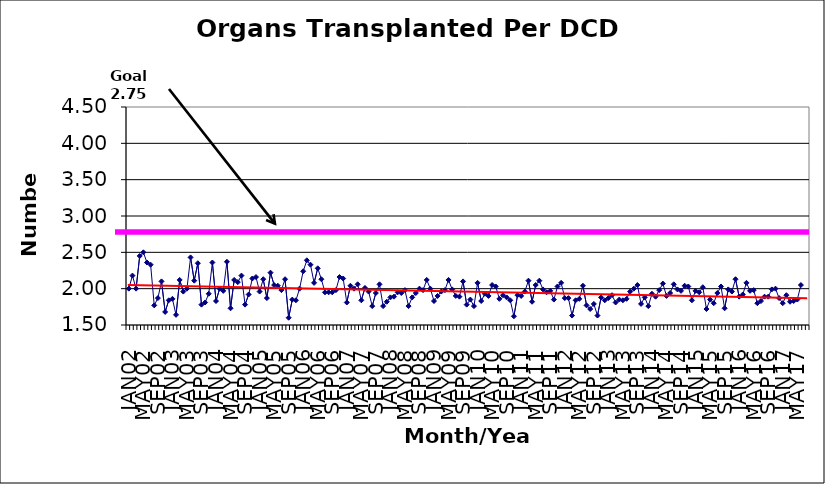
| Category | Series 0 |
|---|---|
| JAN02 | 2 |
| FEB02 | 2.18 |
| MAR02 | 2 |
| APR02 | 2.45 |
| MAY02 | 2.5 |
| JUN02 | 2.36 |
| JUL02 | 2.33 |
| AUG02 | 1.77 |
| SEP02 | 1.87 |
| OCT02 | 2.1 |
| NOV02 | 1.68 |
| DEC02 | 1.84 |
| JAN03 | 1.86 |
| FEB03 | 1.64 |
| MAR03 | 2.12 |
| APR03 | 1.96 |
| MAY03 | 2 |
| JUN03 | 2.43 |
| JUL03 | 2.11 |
| AUG03 | 2.35 |
| SEP03 | 1.78 |
| OCT03 | 1.81 |
| NOV03 | 1.93 |
| DEC03 | 2.36 |
| JAN04 | 1.83 |
| FEB04 | 2 |
| MAR04 | 1.97 |
| APR04 | 2.37 |
| MAY04 | 1.73 |
| JUN04 | 2.12 |
| JUL04 | 2.09 |
| AUG04 | 2.18 |
| SEP04 | 1.78 |
| OCT04 | 1.92 |
| NOV04 | 2.14 |
| DEC04 | 2.16 |
| JAN05 | 1.96 |
| FEB05 | 2.13 |
| MAR05 | 1.87 |
| APR05 | 2.22 |
| MAY05 | 2.05 |
| JUN05 | 2.04 |
| JUL05 | 1.98 |
| AUG05 | 2.13 |
| SEP05 | 1.6 |
| OCT05 | 1.85 |
| NOV05 | 1.84 |
| DEC05 | 2 |
| JAN06 | 2.24 |
| FEB06 | 2.39 |
| MAR06 | 2.33 |
| APR06 | 2.08 |
| MAY06 | 2.28 |
| JUN06 | 2.13 |
| JUL06 | 1.95 |
| AUG06 | 1.95 |
| SEP06 | 1.95 |
| OCT06 | 1.98 |
| NOV06 | 2.16 |
| DEC06 | 2.14 |
| JAN07 | 1.81 |
| FEB07 | 2.04 |
| MAR07 | 2 |
| APR07 | 2.06 |
| MAY07 | 1.84 |
| JUN07 | 2.01 |
| JUL07 | 1.96 |
| AUG07 | 1.76 |
| SEP07 | 1.94 |
| OCT07 | 2.06 |
| NOV07 | 1.76 |
| DEC07 | 1.82 |
| JAN08 | 1.88 |
| FEB08 | 1.89 |
| MAR08 | 1.95 |
| APR08 | 1.94 |
| MAY08 | 1.98 |
| JUN08 | 1.76 |
| JUL08 | 1.88 |
| AUG08 | 1.94 |
| SEP08 | 2 |
| OCT08 | 1.98 |
| NOV08 | 2.12 |
| DEC08 | 2 |
| JAN09 | 1.83 |
| FEB09 | 1.9 |
| MAR09 | 1.96 |
| APR09 | 1.98 |
| MAY09 | 2.12 |
| JUN09 | 1.99 |
| JUL09 | 1.9 |
| AUG09 | 1.89 |
| SEP09 | 2.1 |
| OCT09 | 1.78 |
| NOV09 | 1.85 |
| DEC09 | 1.76 |
| JAN10 | 2.08 |
| FEB10 | 1.83 |
| MAR10 | 1.93 |
| APR10 | 1.9 |
| MAY10 | 2.05 |
| JUN10 | 2.03 |
| JUL10 | 1.86 |
| AUG10 | 1.91 |
| SEP10 | 1.88 |
| OCT10 | 1.84 |
| NOV10 | 1.62 |
| DEC10 | 1.91 |
| JAN11 | 1.9 |
| FEB11 | 1.96 |
| MAR11 | 2.11 |
| APR11 | 1.82 |
| MAY11 | 2.05 |
| JUN11 | 2.11 |
| JUL11 | 1.99 |
| AUG11 | 1.95 |
| SEP11 | 1.97 |
| OCT11 | 1.85 |
| NOV11 | 2.03 |
| DEC11 | 2.08 |
| JAN12 | 1.87 |
| FEB12 | 1.87 |
| MAR12 | 1.63 |
| APR12 | 1.84 |
| MAY12 | 1.86 |
| JUN12 | 2.04 |
| JUL12 | 1.77 |
| AUG12 | 1.72 |
| SEP12 | 1.79 |
| OCT12 | 1.63 |
| NOV12 | 1.88 |
| DEC12 | 1.84 |
| JAN13 | 1.87 |
| FEB13 | 1.91 |
| MAR13 | 1.81 |
| APR13 | 1.85 |
| MAY13 | 1.84 |
| JUN13 | 1.86 |
| JUL13 | 1.96 |
| AUG13 | 2 |
| SEP13 | 2.05 |
| OCT13 | 1.79 |
| NOV13 | 1.88 |
| DEC13 | 1.76 |
| JAN14 | 1.93 |
| FEB14 | 1.89 |
| MAR14 | 1.98 |
| APR14 | 2.07 |
| MAY14 | 1.9 |
| JUN14 | 1.94 |
| JUL14 | 2.06 |
| AUG14 | 1.99 |
| SEP14 | 1.97 |
| OCT14 | 2.04 |
| NOV14 | 2.03 |
| DEC14 | 1.84 |
| JAN15 | 1.97 |
| FEB15 | 1.95 |
| MAR15 | 2.02 |
| APR15 | 1.72 |
| MAY15 | 1.85 |
| JUN15 | 1.8 |
| JUL15 | 1.94 |
| AUG15 | 2.03 |
| SEP15 | 1.73 |
| OCT15 | 1.99 |
| NOV15 | 1.96 |
| DEC15 | 2.13 |
| JAN16 | 1.89 |
| FEB16 | 1.92 |
| MAR16 | 2.08 |
| APR16 | 1.97 |
| MAY16 | 1.98 |
| JUN16 | 1.8 |
| JUL16 | 1.83 |
| AUG16 | 1.89 |
| SEP16 | 1.89 |
| OCT16 | 1.99 |
| NOV16 | 2 |
| DEC16 | 1.87 |
| JAN17 | 1.8 |
| FEB17 | 1.91 |
| MAR17 | 1.82 |
| APR17 | 1.83 |
| MAY17 | 1.85 |
| JUN17 | 2.05 |